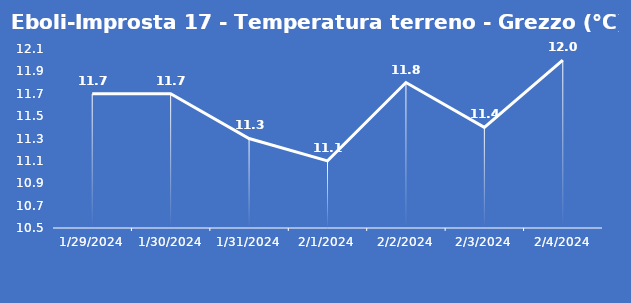
| Category | Eboli-Improsta 17 - Temperatura terreno - Grezzo (°C) |
|---|---|
| 1/29/24 | 11.7 |
| 1/30/24 | 11.7 |
| 1/31/24 | 11.3 |
| 2/1/24 | 11.1 |
| 2/2/24 | 11.8 |
| 2/3/24 | 11.4 |
| 2/4/24 | 12 |